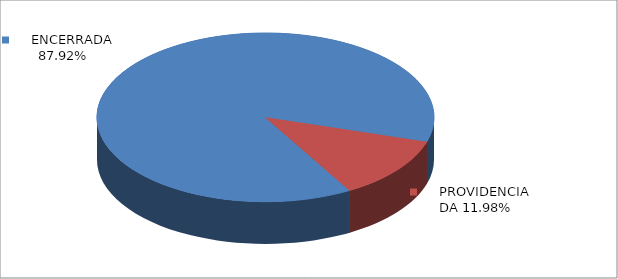
| Category | Series 0 |
|---|---|
|      ENCERRADA | 0.879 |
|      PROVIDENCIADA | 0.12 |